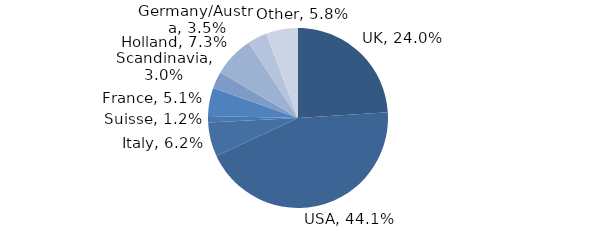
| Category | Investment Style |
|---|---|
| UK | 0.24 |
| USA | 0.441 |
| Italy | 0.062 |
| Suisse | 0.012 |
| France | 0.051 |
| Scandinavia | 0.03 |
| Holland | 0.073 |
| Germany/Austria | 0.035 |
| Other | 0.058 |